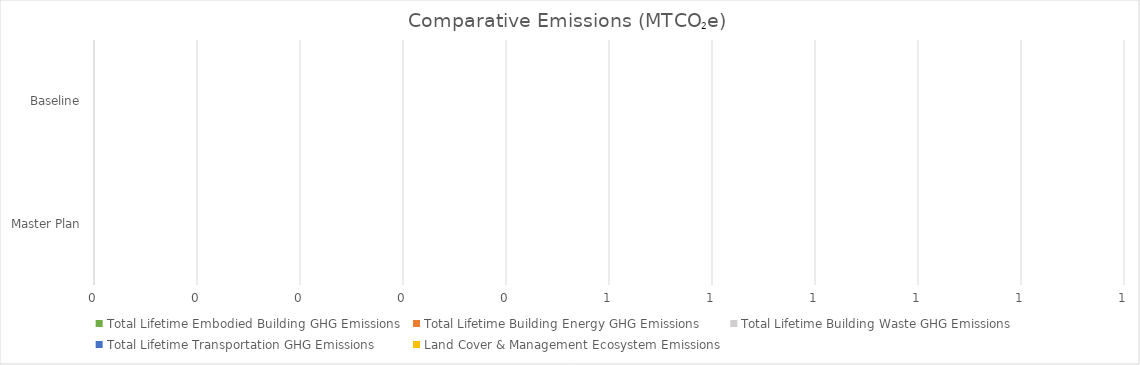
| Category | Total Lifetime Embodied Building GHG Emissions | Total Lifetime Building Energy GHG Emissions | Total Lifetime Building Waste GHG Emissions | Total Lifetime Transportation GHG Emissions | Land Cover & Management Ecosystem Emissions |
|---|---|---|---|---|---|
| Master Plan | 0 | 0 | 0 | 0 |  |
| Baseline | 0 | 0 | 0 | 0 |  |